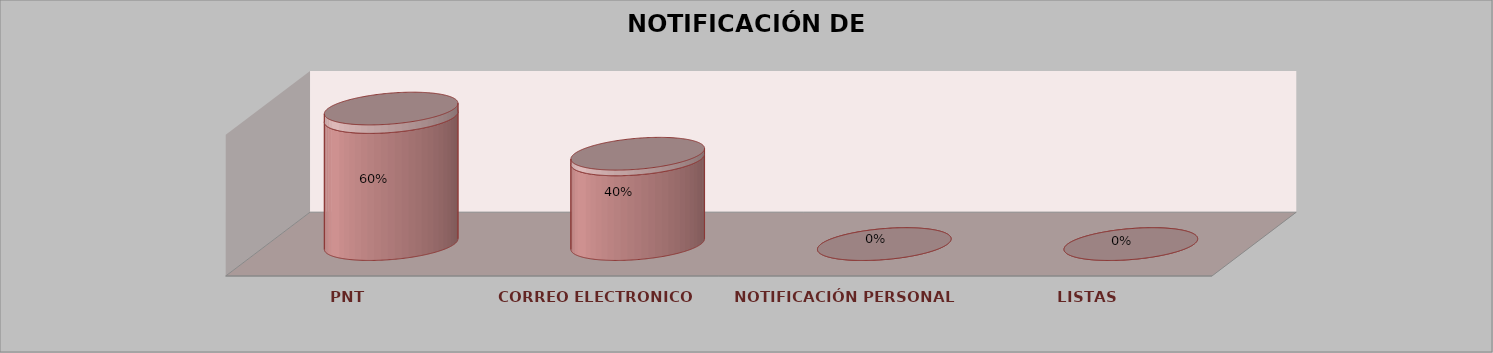
| Category | Series 0 | Series 1 | Series 2 | Series 3 | Series 4 |
|---|---|---|---|---|---|
| PNT |  |  |  | 9 | 0.6 |
| CORREO ELECTRONICO |  |  |  | 6 | 0.4 |
| NOTIFICACIÓN PERSONAL |  |  |  | 0 | 0 |
| LISTAS |  |  |  | 0 | 0 |